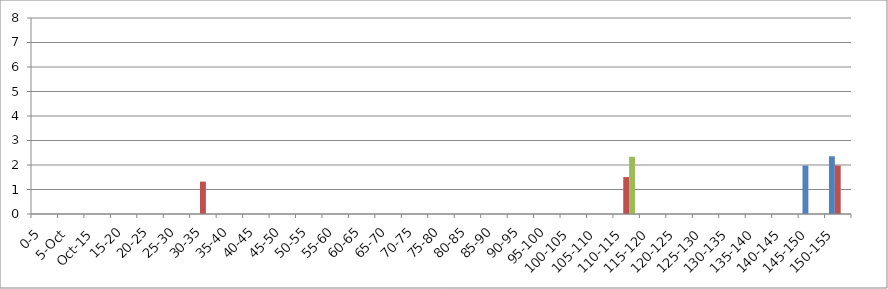
| Category | 119875 | 146067 | 241240 |
|---|---|---|---|
| 0-5 | 0 | 0 | 0 |
| 5-Oct | 0 | 0 | 0 |
| Oct-15 | 0 | 0 | 0 |
| 15-20 | 0 | 0 | 0 |
| 20-25 | 0 | 0 | 0 |
| 25-30 | 0 | 0 | 0 |
| 30-35 | 0 | 1.321 | 0 |
| 35-40 | 0 | 0 | 0 |
| 40-45 | 0 | 0 | 0 |
| 45-50 | 0 | 0 | 0 |
| 50-55 | 0 | 0 | 0 |
| 55-60 | 0 | 0 | 0 |
| 60-65 | 0 | 0 | 0 |
| 65-70 | 0 | 0 | 0 |
| 70-75 | 0 | 0 | 0 |
| 75-80 | 0 | 0 | 0 |
| 80-85 | 0 | 0 | 0 |
| 85-90 | 0 | 0 | 0 |
| 90-95 | 0 | 0 | 0 |
| 95-100 | 0 | 0 | 0 |
| 100-105 | 0 | 0 | 0 |
| 105-110 | 0 | 0 | 0 |
| 110-115 | 0 | 1.507 | 2.335 |
| 115-120 | 0 | 0 | 0 |
| 120-125 | 0 | 0 | 0 |
| 125-130 | 0 | 0 | 0 |
| 130-135 | 0 | 0 | 0 |
| 135-140 | 0 | 0 | 0 |
| 140-145 | 0 | 0 | 0 |
| 145-150 | 1.978 | 0 | 0 |
| 150-155 | 2.355 | 1.98 | 0 |